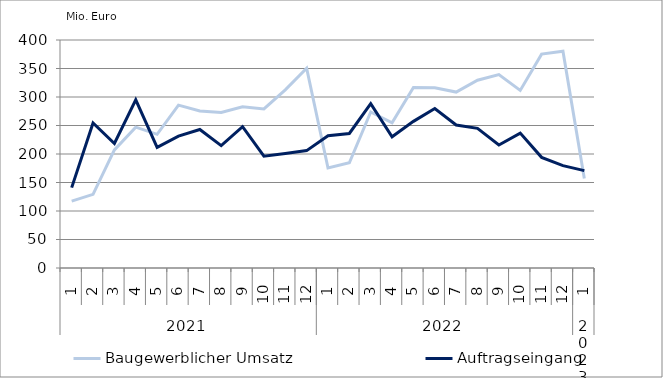
| Category | Baugewerblicher Umsatz | Auftragseingang |
|---|---|---|
| 0 | 117421.805 | 141020.655 |
| 1 | 129162.55 | 254416.876 |
| 2 | 207280.837 | 218451.405 |
| 3 | 247094.279 | 295077.868 |
| 4 | 234515.312 | 211696.129 |
| 5 | 285732.845 | 231455.155 |
| 6 | 275480.885 | 242932.505 |
| 7 | 272787.524 | 214636.944 |
| 8 | 282850.254 | 247827.991 |
| 9 | 279173.21 | 196069.238 |
| 10 | 312511.437 | 201015.897 |
| 11 | 350582.01 | 205949.991 |
| 12 | 175456.852 | 232178.255 |
| 13 | 184578.32 | 236006.862 |
| 14 | 273732.567 | 288451.109 |
| 15 | 254683.671 | 230228.968 |
| 16 | 316794.568 | 257235.39 |
| 17 | 316277.567 | 279900.179 |
| 18 | 308621.034 | 250827.343 |
| 19 | 329490.411 | 244949.341 |
| 20 | 339435.208 | 215809.075 |
| 21 | 311599.811 | 236674.056 |
| 22 | 375203.994 | 194107.214 |
| 23 | 380445.583 | 179631.624 |
| 24 | 156885.157 | 170764.939 |